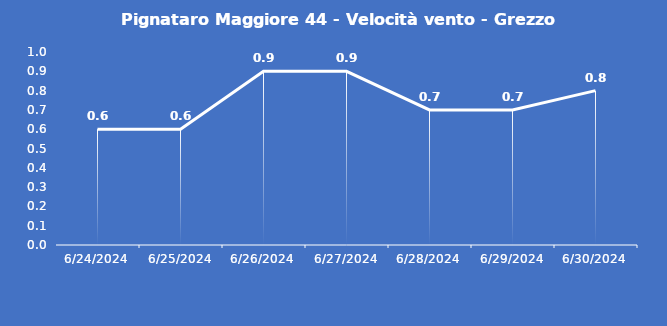
| Category | Pignataro Maggiore 44 - Velocità vento - Grezzo (m/s) |
|---|---|
| 6/24/24 | 0.6 |
| 6/25/24 | 0.6 |
| 6/26/24 | 0.9 |
| 6/27/24 | 0.9 |
| 6/28/24 | 0.7 |
| 6/29/24 | 0.7 |
| 6/30/24 | 0.8 |